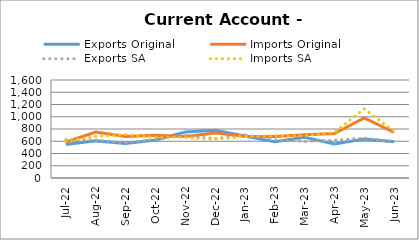
| Category | Exports Original | Imports Original | Exports SA | Imports SA |
|---|---|---|---|---|
| 2022-07-01 | 546 | 587 | 625 | 603 |
| 2022-08-01 | 606 | 750 | 619 | 681 |
| 2022-09-01 | 565 | 678 | 577 | 709 |
| 2022-10-01 | 622 | 699 | 630 | 665 |
| 2022-11-01 | 751 | 677 | 696 | 662 |
| 2022-12-01 | 780 | 733 | 642 | 633 |
| 2023-01-01 | 686 | 681 | 705 | 679 |
| 2023-02-01 | 591 | 677 | 625 | 691 |
| 2023-03-01 | 666 | 705 | 597 | 691 |
| 2023-04-01 | 554 | 725 | 619 | 742 |
| 2023-05-01 | 638 | 980 | 651 | 1129 |
| 2023-06-01 | 591 | 746 | 597 | 760 |